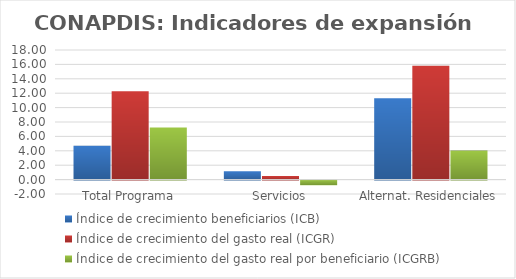
| Category | Índice de crecimiento beneficiarios (ICB)  | Índice de crecimiento del gasto real (ICGR)  | Índice de crecimiento del gasto real por beneficiario (ICGRB)  |
|---|---|---|---|
| Total Programa | 4.688 | 12.276 | 7.248 |
| Servicios | 1.146 | 0.487 | -0.651 |
| Alternat. Residenciales | 11.311 | 15.797 | 4.03 |